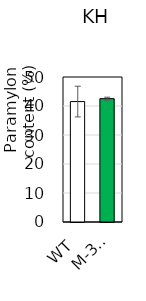
| Category | KH |
|---|---|
| 0 | 41.529 |
| 1 | 42.531 |